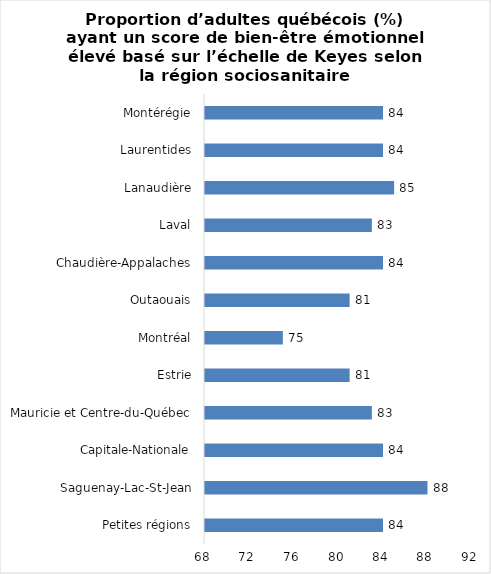
| Category | Series 0 |
|---|---|
| Petites régions | 84 |
| Saguenay-Lac-St-Jean | 88 |
| Capitale-Nationale | 84 |
| Mauricie et Centre-du-Québec | 83 |
| Estrie | 81 |
| Montréal | 75 |
| Outaouais | 81 |
| Chaudière-Appalaches | 84 |
| Laval | 83 |
| Lanaudière | 85 |
| Laurentides | 84 |
| Montérégie | 84 |